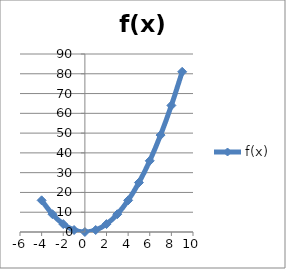
| Category | f(x) |
|---|---|
| -4.0 | 16 |
| -3.0 | 9 |
| -2.0 | 4 |
| -1.0 | 1 |
| 0.0 | 0 |
| 1.0 | 1 |
| 2.0 | 4 |
| 3.0 | 9 |
| 4.0 | 16 |
| 5.0 | 25 |
| 6.0 | 36 |
| 7.0 | 49 |
| 8.0 | 64 |
| 9.0 | 81 |